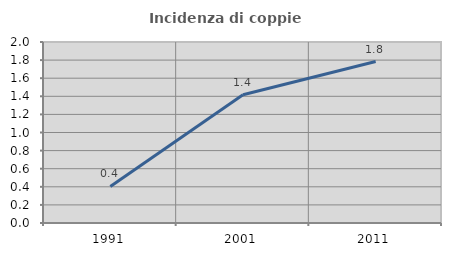
| Category | Incidenza di coppie miste |
|---|---|
| 1991.0 | 0.404 |
| 2001.0 | 1.417 |
| 2011.0 | 1.784 |